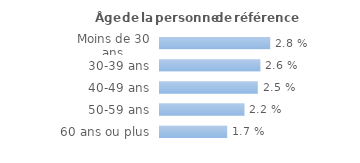
| Category | Series 0 |
|---|---|
| Moins de 30 ans | 0.028 |
| 30-39 ans | 0.026 |
| 40-49 ans | 0.025 |
| 50-59 ans | 0.022 |
| 60 ans ou plus | 0.017 |